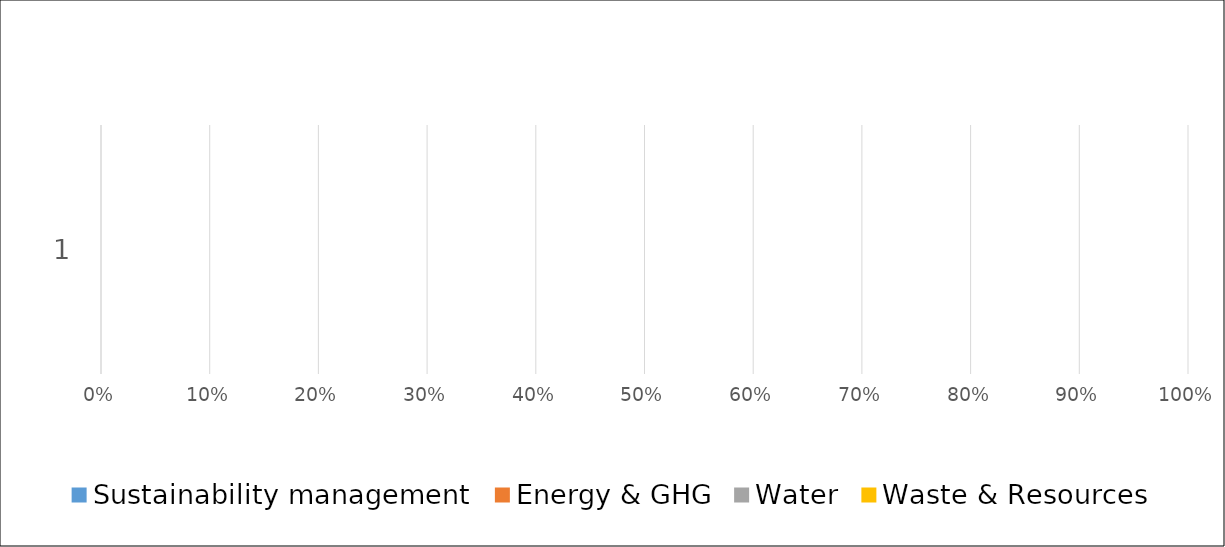
| Category | Sustainability management  | Energy & GHG | Water | Waste & Resources |
|---|---|---|---|---|
| 0 | 0 | 0 | 0 | 0 |